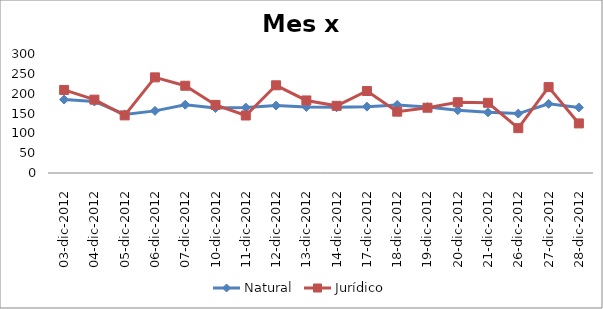
| Category | Natural | Jurídico |
|---|---|---|
| 03-dic-2012 | 185.146 | 209.395 |
| 04-dic-2012 | 180.309 | 184.91 |
| 05-dic-2012 | 147.77 | 145.248 |
| 06-dic-2012 | 156.62 | 241.098 |
| 07-dic-2012 | 172.158 | 219.949 |
| 10-dic-2012 | 163.716 | 171.671 |
| 11-dic-2012 | 164.942 | 144.969 |
| 12-dic-2012 | 169.973 | 221.088 |
| 13-dic-2012 | 166.398 | 182.917 |
| 14-dic-2012 | 165.749 | 169.371 |
| 17-dic-2012 | 167.258 | 206.661 |
| 18-dic-2012 | 171.68 | 154.628 |
| 19-dic-2012 | 166.126 | 164.558 |
| 20-dic-2012 | 158.293 | 178.514 |
| 21-dic-2012 | 153.056 | 177 |
| 26-dic-2012 | 149.804 | 113.056 |
| 27-dic-2012 | 174.408 | 216.545 |
| 28-dic-2012 | 165.226 | 125 |